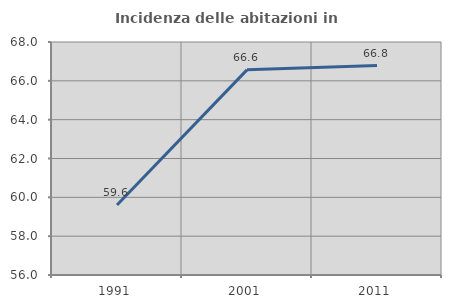
| Category | Incidenza delle abitazioni in proprietà  |
|---|---|
| 1991.0 | 59.602 |
| 2001.0 | 66.565 |
| 2011.0 | 66.787 |